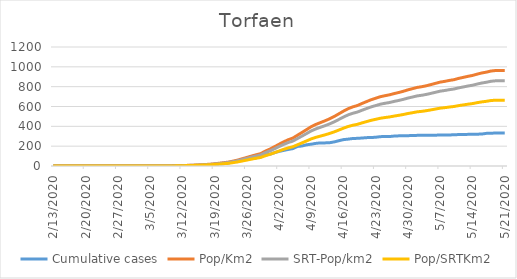
| Category | Cumulative cases | Pop/Km2 | SRT-Pop/km2 | Pop/SRTKm2 |
|---|---|---|---|---|
| 5/21/20 | 333 | 963.015 | 859.068 | 663.781 |
| 5/20/20 | 333 | 963.015 | 859.068 | 663.781 |
| 5/19/20 | 333 | 962.789 | 858.866 | 663.626 |
| 5/18/20 | 330 | 957.51 | 854.157 | 659.987 |
| 5/17/20 | 329 | 946.275 | 844.134 | 652.243 |
| 5/16/20 | 322 | 937.904 | 836.668 | 646.474 |
| 5/15/20 | 321 | 926.141 | 826.174 | 638.365 |
| 5/14/20 | 321 | 913.096 | 814.537 | 629.374 |
| 5/13/20 | 319 | 904.047 | 806.465 | 623.136 |
| 5/12/20 | 318 | 893.641 | 797.182 | 615.964 |
| 5/11/20 | 317 | 883.31 | 787.966 | 608.843 |
| 5/10/20 | 315 | 870.491 | 776.531 | 600.007 |
| 5/9/20 | 313 | 863.026 | 769.871 | 594.862 |
| 5/8/20 | 312 | 853.676 | 761.53 | 588.417 |
| 5/7/20 | 312 | 846.135 | 754.804 | 583.219 |
| 5/6/20 | 311 | 833.693 | 743.705 | 574.643 |
| 5/5/20 | 309 | 821.251 | 732.605 | 566.067 |
| 5/4/20 | 309 | 809.261 | 721.91 | 557.803 |
| 5/3/20 | 309 | 799.609 | 713.3 | 551.15 |
| 5/2/20 | 309 | 792.521 | 706.977 | 546.264 |
| 5/1/20 | 307 | 779.928 | 695.743 | 537.584 |
| 4/30/20 | 306 | 768.014 | 685.115 | 529.372 |
| 4/29/20 | 304 | 753.536 | 672.2 | 519.393 |
| 4/28/20 | 304 | 741.245 | 661.235 | 510.921 |
| 4/27/20 | 302 | 730.235 | 651.414 | 503.333 |
| 4/26/20 | 297 | 717.869 | 640.382 | 494.809 |
| 4/25/20 | 297 | 708.895 | 632.378 | 488.623 |
| 4/24/20 | 296 | 698.715 | 623.297 | 481.607 |
| 4/23/20 | 290 | 683.106 | 609.372 | 470.848 |
| 4/22/20 | 287 | 668.176 | 596.053 | 460.557 |
| 4/21/20 | 286 | 649.249 | 579.169 | 447.511 |
| 4/20/20 | 282 | 630.171 | 562.151 | 434.361 |
| 4/19/20 | 279 | 609.434 | 543.652 | 420.067 |
| 4/18/20 | 277 | 596.012 | 531.679 | 410.816 |
| 4/17/20 | 271 | 577.688 | 515.333 | 398.186 |
| 4/16/20 | 266 | 553.407 | 493.673 | 381.45 |
| 4/15/20 | 255 | 526.336 | 469.524 | 362.79 |
| 4/14/20 | 243 | 499.567 | 445.644 | 344.339 |
| 4/13/20 | 235 | 476.191 | 424.791 | 328.226 |
| 4/12/20 | 233 | 456.058 | 406.831 | 314.349 |
| 4/11/20 | 233 | 437.734 | 390.485 | 301.719 |
| 4/10/20 | 228 | 419.335 | 374.072 | 289.037 |
| 4/9/20 | 220 | 396.713 | 353.892 | 273.444 |
| 4/8/20 | 214 | 367.304 | 327.658 | 253.174 |
| 4/7/20 | 202 | 338.424 | 301.895 | 233.267 |
| 4/6/20 | 197 | 310.071 | 276.602 | 213.724 |
| 4/5/20 | 175 | 281.492 | 251.108 | 194.025 |
| 4/4/20 | 167 | 264.827 | 236.242 | 182.539 |
| 4/3/20 | 157 | 243.638 | 217.34 | 167.933 |
| 4/2/20 | 147 | 219.206 | 195.545 | 151.093 |
| 4/1/20 | 134 | 194.096 | 173.145 | 133.785 |
| 3/31/20 | 118 | 169.966 | 151.62 | 117.153 |
| 3/30/20 | 111 | 149.531 | 133.391 | 103.068 |
| 3/29/20 | 91 | 124.345 | 110.923 | 85.708 |
| 3/28/20 | 82 | 112.582 | 100.43 | 77.6 |
| 3/27/20 | 76 | 100.064 | 89.263 | 68.972 |
| 3/26/20 | 68 | 86.114 | 76.819 | 59.356 |
| 3/25/20 | 59 | 72.993 | 65.115 | 50.312 |
| 3/24/20 | 50 | 59.194 | 52.805 | 40.801 |
| 3/23/20 | 43 | 49.014 | 43.724 | 33.784 |
| 3/22/20 | 29 | 39.211 | 34.979 | 27.027 |
| 3/21/20 | 24 | 33.48 | 29.867 | 23.077 |
| 3/20/20 | 22 | 27.825 | 24.822 | 19.179 |
| 3/19/20 | 17 | 22.396 | 19.978 | 15.437 |
| 3/18/20 | 9 | 17.871 | 15.942 | 12.318 |
| 3/17/20 | 6 | 15.232 | 13.588 | 10.499 |
| 3/16/20 | 4 | 12.442 | 11.099 | 8.576 |
| 3/15/20 | 3 | 9.878 | 8.812 | 6.809 |
| 3/14/20 | 2 | 7.691 | 6.861 | 5.302 |
| 3/13/20 | 2 | 6.259 | 5.583 | 4.314 |
| 3/12/20 | 0 | 4.223 | 3.767 | 2.911 |
| 3/11/20 | 0 | 2.413 | 2.153 | 1.663 |
| 3/10/20 | 0 | 1.357 | 1.211 | 0.936 |
| 3/9/20 | 0 | 0.528 | 0.471 | 0.364 |
| 3/8/20 | 0 | 0.302 | 0.269 | 0.208 |
| 3/7/20 | 0 | 0.302 | 0.269 | 0.208 |
| 3/6/20 | 0 | 0.151 | 0.135 | 0.104 |
| 3/5/20 | 0 | 0.151 | 0.135 | 0.104 |
| 3/4/20 | 0 | 0.151 | 0.135 | 0.104 |
| 3/3/20 | 0 | 0.075 | 0.067 | 0.052 |
| 3/2/20 | 0 | 0.075 | 0.067 | 0.052 |
| 3/1/20 | 0 | 0.075 | 0.067 | 0.052 |
| 2/29/20 | 0 | 0.075 | 0.067 | 0.052 |
| 2/28/20 | 0 | 0.075 | 0.067 | 0.052 |
| 2/27/20 | 0 | 0.075 | 0.067 | 0.052 |
| 2/26/20 | 0 | 0 | 0 | 0 |
| 2/25/20 | 0 | 0 | 0 | 0 |
| 2/24/20 | 0 | 0 | 0 | 0 |
| 2/23/20 | 0 | 0 | 0 | 0 |
| 2/22/20 | 0 | 0 | 0 | 0 |
| 2/21/20 | 0 | 0 | 0 | 0 |
| 2/20/20 | 0 | 0 | 0 | 0 |
| 2/19/20 | 0 | 0 | 0 | 0 |
| 2/18/20 | 0 | 0 | 0 | 0 |
| 2/17/20 | 0 | 0 | 0 | 0 |
| 2/16/20 | 0 | 0 | 0 | 0 |
| 2/15/20 | 0 | 0 | 0 | 0 |
| 2/14/20 | 0 | 0 | 0 | 0 |
| 2/13/20 | 0 | 0 | 0 | 0 |